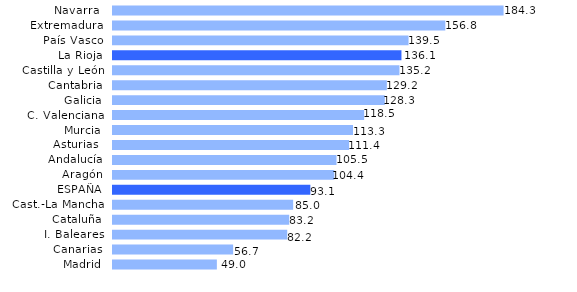
| Category | Series 0 |
|---|---|
| Madrid | 49.016 |
| Canarias | 56.692 |
| I. Baleares | 82.224 |
| Cataluña | 83.167 |
| Cast.-La Mancha | 85.016 |
| ESPAÑA | 93.138 |
| Aragón | 104.444 |
| Andalucía | 105.467 |
| Asturias  | 111.416 |
| Murcia | 113.26 |
| C. Valenciana | 118.528 |
| Galicia | 128.271 |
| Cantabria | 129.222 |
| Castilla y León | 135.187 |
| La Rioja | 136.125 |
| País Vasco | 139.473 |
| Extremadura | 156.827 |
| Navarra  | 184.32 |